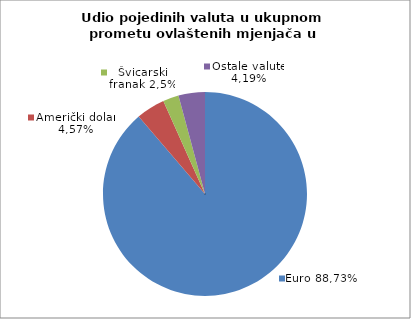
| Category | EUR |
|---|---|
| 0 | 88.733 |
| 1 | 4.571 |
| 2 | 2.502 |
| 3 | 4.194 |